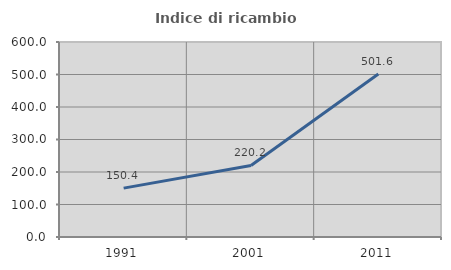
| Category | Indice di ricambio occupazionale  |
|---|---|
| 1991.0 | 150.388 |
| 2001.0 | 220.175 |
| 2011.0 | 501.587 |